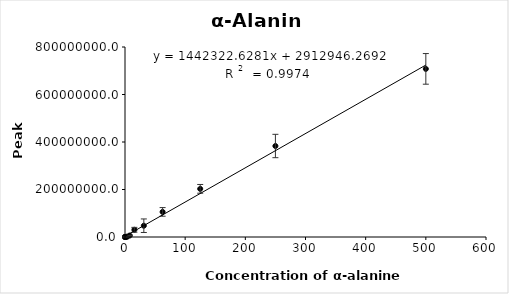
| Category | Series 0 |
|---|---|
| 0.03 | 43937.333 |
| 0.06 | 18093.667 |
| 0.12 | 27340.667 |
| 0.24 | 85094.667 |
| 0.49 | 77538 |
| 0.98 | 179227 |
| 1.95 | 188550 |
| 3.9 | 1798665.333 |
| 7.81 | 6227753 |
| 15.6 | 30384128.667 |
| 31.3 | 47502023.333 |
| 62.5 | 105687592 |
| 125.0 | 202741146.667 |
| 250.0 | 383153125.333 |
| 500.0 | 707873760 |